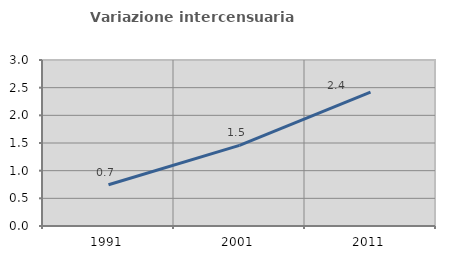
| Category | Variazione intercensuaria annua |
|---|---|
| 1991.0 | 0.746 |
| 2001.0 | 1.458 |
| 2011.0 | 2.419 |